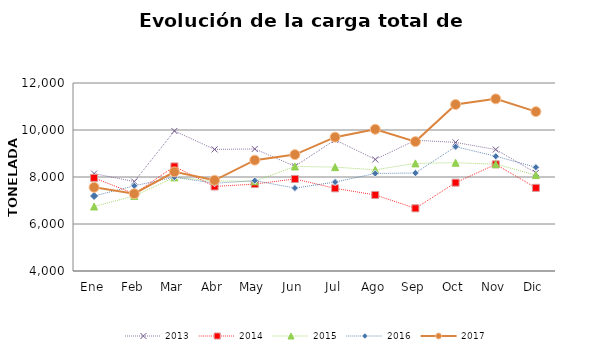
| Category | 2013 | 2014 | 2015 | 2016 | 2017 |
|---|---|---|---|---|---|
| Ene | 8146.26 | 7963.202 | 6745.607 | 7193.039 | 7560.169 |
| Feb | 7804.624 | 7288.113 | 7194.269 | 7625.194 | 7288.718 |
| Mar | 9958.287 | 8449.338 | 7983.29 | 7992.223 | 8218.22 |
| Abr | 9174.83 | 7595.892 | 7831.182 | 7732.339 | 7859.33 |
| May | 9192.956 | 7699.675 | 7817.051 | 7845.532 | 8717.327 |
| Jun | 8456.254 | 7916.029 | 8447.917 | 7528.791 | 8953.011 |
| Jul | 9580.712 | 7517.75 | 8419.922 | 7784.263 | 9694.987 |
| Ago | 8746.669 | 7235.999 | 8306.139 | 8149.931 | 10031.315 |
| Sep | 9564.916 | 6667.536 | 8579.519 | 8170.614 | 9506.629 |
| Oct | 9471.434 | 7759.064 | 8607.881 | 9289.467 | 11085.043 |
| Nov | 9168.374 | 8537.316 | 8546.58 | 8882.495 | 11324.498 |
| Dic | 8173.299 | 7539.564 | 8082.978 | 8415.198 | 10782.277 |